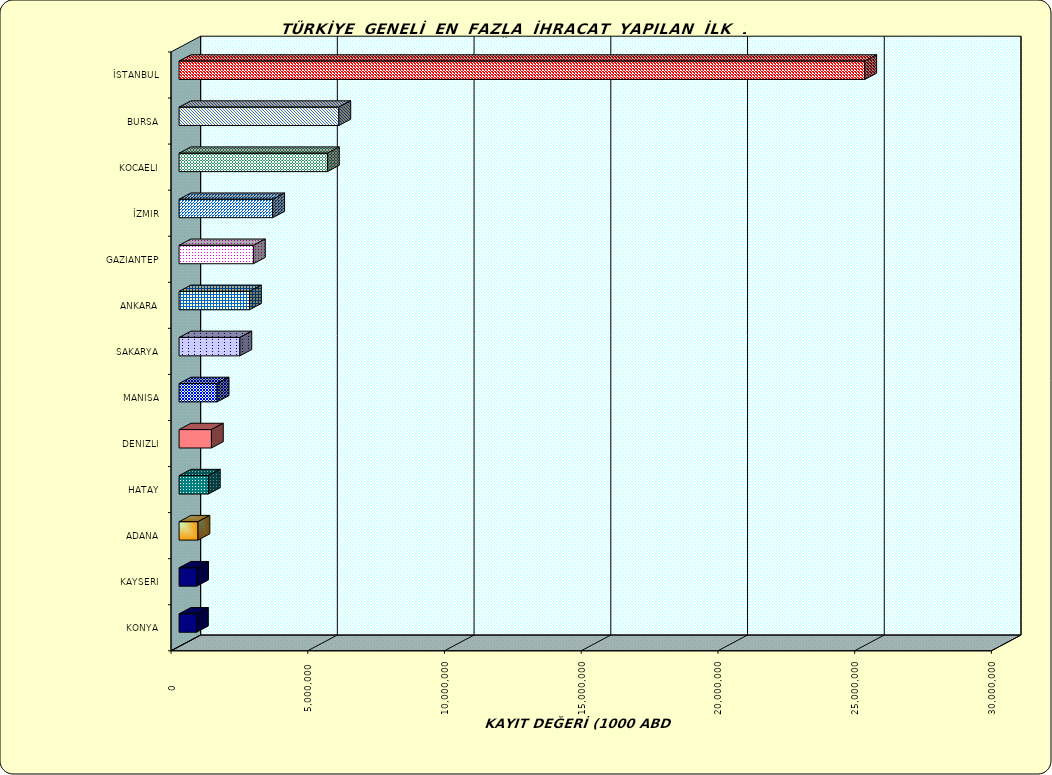
| Category | Series 0 |
|---|---|
| İSTANBUL | 25074421.296 |
| BURSA | 5843272.334 |
| KOCAELI | 5426077.726 |
| İZMIR | 3424984.598 |
| GAZIANTEP | 2719247.018 |
| ANKARA | 2575736.123 |
| SAKARYA | 2224116.471 |
| MANISA | 1392438.809 |
| DENIZLI | 1183018.865 |
| HATAY | 1070846.617 |
| ADANA | 691733.453 |
| KAYSERI | 643223.158 |
| KONYA | 636813.263 |